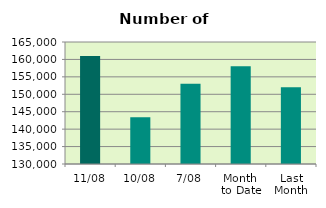
| Category | Series 0 |
|---|---|
| 11/08 | 160958 |
| 10/08 | 143398 |
| 7/08 | 153040 |
| Month 
to Date | 158053.714 |
| Last
Month | 152026.87 |